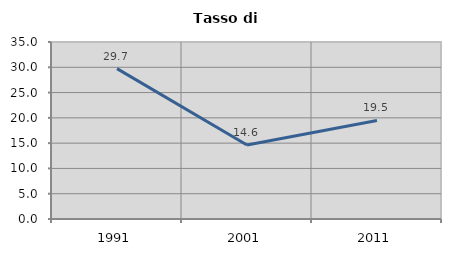
| Category | Tasso di disoccupazione   |
|---|---|
| 1991.0 | 29.732 |
| 2001.0 | 14.622 |
| 2011.0 | 19.496 |